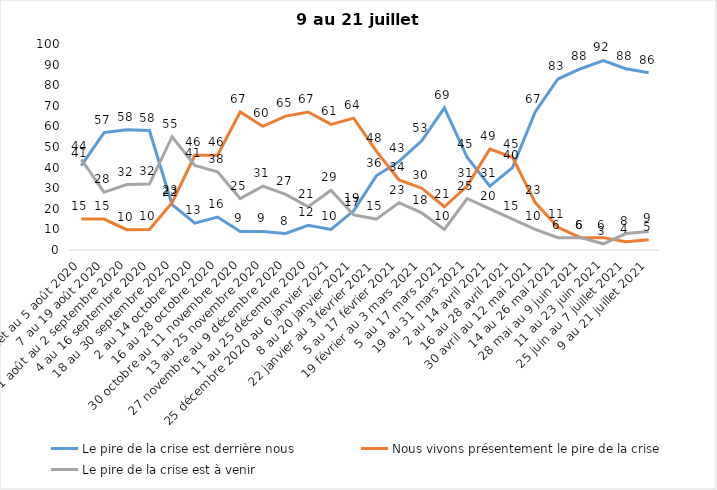
| Category | Le pire de la crise est derrière nous | Nous vivons présentement le pire de la crise | Le pire de la crise est à venir |
|---|---|---|---|
| 24 juillet au 5 août 2020 | 41 | 15 | 44 |
| 7 au 19 août 2020 | 57 | 15 | 28 |
| 21 août au 2 septembre 2020 | 58.39 | 9.84 | 31.77 |
| 4 au 16 septembre 2020 | 58 | 10 | 32 |
| 18 au 30 septembre 2020 | 22 | 23 | 55 |
| 2 au 14 octobre 2020 | 13 | 46 | 41 |
| 16 au 28 octobre 2020 | 16 | 46 | 38 |
| 30 octobre au 11 novembre 2020 | 9 | 67 | 25 |
| 13 au 25 novembre 2020 | 9 | 60 | 31 |
| 27 novembre au 9 décembre 2020 | 8 | 65 | 27 |
| 11 au 25 décembre 2020 | 12 | 67 | 21 |
| 25 décembre 2020 au 6 janvier 2021 | 10 | 61 | 29 |
| 8 au 20 janvier 2021 | 19 | 64 | 17 |
| 22 janvier au 3 février 2021 | 36 | 48 | 15 |
| 5 au 17 février 2021 | 43 | 34 | 23 |
| 19 février au 3 mars 2021 | 53 | 30 | 18 |
| 5 au 17 mars 2021 | 69 | 21 | 10 |
| 19 au 31 mars 2021 | 45 | 31 | 25 |
| 2 au 14 avril 2021 | 31 | 49 | 20 |
| 16 au 28 avril 2021 | 40 | 45 | 15 |
| 30 avril au 12 mai 2021 | 67 | 23 | 10 |
| 14 au 26 mai 2021 | 83 | 11 | 6 |
| 28 mai au 9 juin 2021 | 88 | 6 | 6 |
| 11 au 23 juin 2021 | 92 | 6 | 3 |
| 25 juin au 7 juillet 2021 | 88 | 4 | 8 |
| 9 au 21 juillet 2021 | 86 | 5 | 9 |